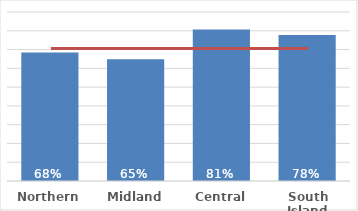
| Category | Dep 5 |
|---|---|
| Northern | 0.685 |
| Midland | 0.648 |
| Central | 0.806 |
| South Island | 0.777 |